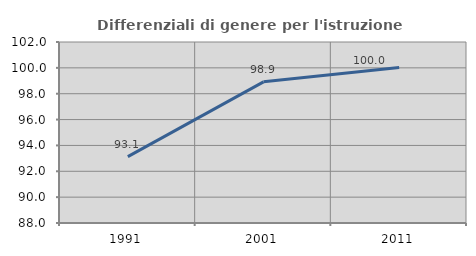
| Category | Differenziali di genere per l'istruzione superiore |
|---|---|
| 1991.0 | 93.136 |
| 2001.0 | 98.918 |
| 2011.0 | 100.031 |